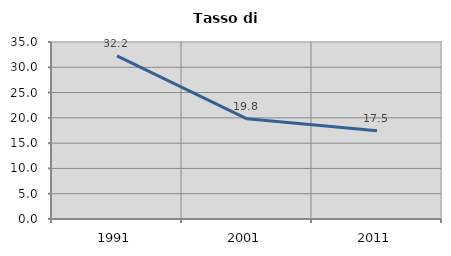
| Category | Tasso di disoccupazione   |
|---|---|
| 1991.0 | 32.24 |
| 2001.0 | 19.807 |
| 2011.0 | 17.462 |